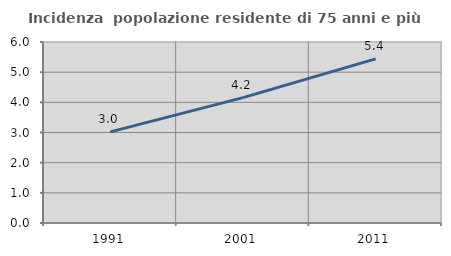
| Category | Incidenza  popolazione residente di 75 anni e più |
|---|---|
| 1991.0 | 3.019 |
| 2001.0 | 4.156 |
| 2011.0 | 5.44 |